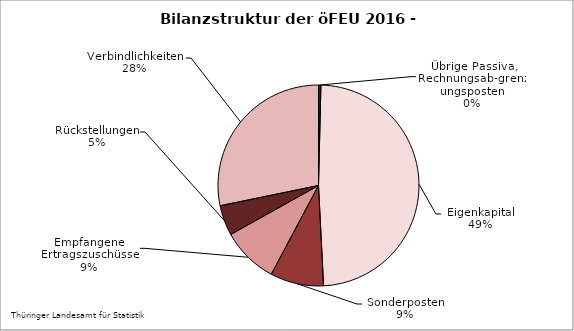
| Category | Series 0 |
|---|---|
| Übrige Passiva, Rechnungsab-grenzungsposten | 0.385 |
| Eigenkapital | 48.809 |
| SoPo mit Rücklageanteil, aus Zuwendungen und anderweitig nicht genannt | 8.583 |
| Empfangene Ertragszuschüsse | 9.124 |
| Rückstellungen | 4.868 |
| Verbindlichkeiten | 28.23 |